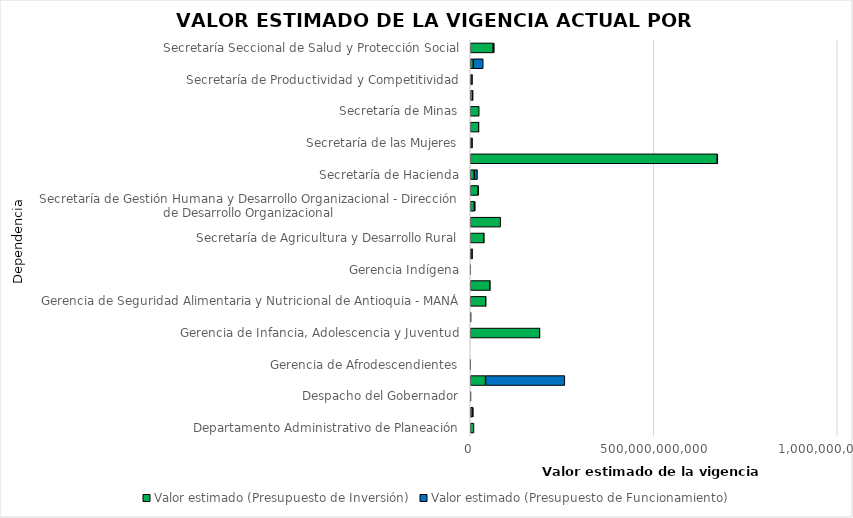
| Category | Valor estimado (Presupuesto de Inversión) | Valor estimado (Presupuesto de Funcionamiento) |
|---|---|---|
| Departamento Administrativo de Planeación | 10212948569 | 0 |
| Departamento Administrativo del Sistema de Prevención, Atención y Recuperación de Desastres - DAPARD | 6026356453 | 2237449457 |
| Despacho del Gobernador | 0 | 1939115167 |
| Fábrica de Licores y Alcoholes de Antioquia - FLA | 41693366375 | 216039172419.851 |
| Gerencia de Afrodescendientes | 639842368 | 26437500 |
| Gerencia de Auditoría Interna | 0 | 0 |
| Gerencia de Infancia, Adolescencia y Juventud | 189298127135 | 30000000 |
| Gerencia de Paz | 2354901274 | 0 |
| Gerencia de Seguridad Alimentaria y Nutricional de Antioquia - MANÁ | 42599311840 | 10000000 |
| Gerencia de Servicios Públicos | 53871736916 | 63642000 |
| Gerencia Indígena | 914594121 | 0 |
| Oficina de Comunicaciones | 5457336000 | 159800000 |
| Secretaría de Agricultura y Desarrollo Rural | 37412062283.775 | 33000000 |
| Secretaría de Educación | 82861828443 | 0 |
| Secretaría de Gestión Humana y Desarrollo Organizacional - Dirección de Desarrollo Organizacional | 11233303884 | 2392481808 |
| Secretaría de Gobierno | 21287978254 | 1454194000 |
| Secretaría de Hacienda | 10803539633 | 8905840365 |
| Secretaría de Infraestructura Física | 672855341674.8 | 1809275778 |
| Secretaría de las Mujeres | 5368000020 | 40000000 |
| Secretaría de Medio Ambiente | 23163024396 | 30000000 |
| Secretaría de Minas | 24446099863.8 | 0 |
| Secretaría de Participación Ciudadana y Desarrollo Social | 6886327940 | 408357395 |
| Secretaría de Productividad y Competitividad | 5162640000 | 250000000 |
| Secretaría General | 8392257907 | 27013436813 |
| Secretaría Seccional de Salud y Protección Social | 62522551053 | 3012608703 |